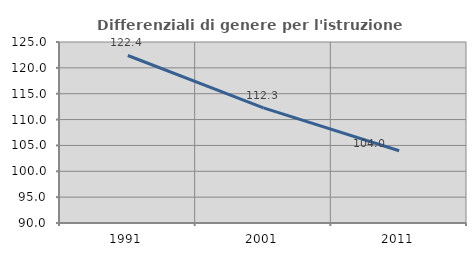
| Category | Differenziali di genere per l'istruzione superiore |
|---|---|
| 1991.0 | 122.39 |
| 2001.0 | 112.264 |
| 2011.0 | 103.963 |